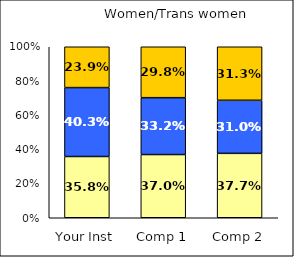
| Category | Low Respect | Average Respect | High Respect |
|---|---|---|---|
| Your Inst | 0.358 | 0.403 | 0.239 |
| Comp 1 | 0.37 | 0.332 | 0.298 |
| Comp 2 | 0.377 | 0.31 | 0.313 |